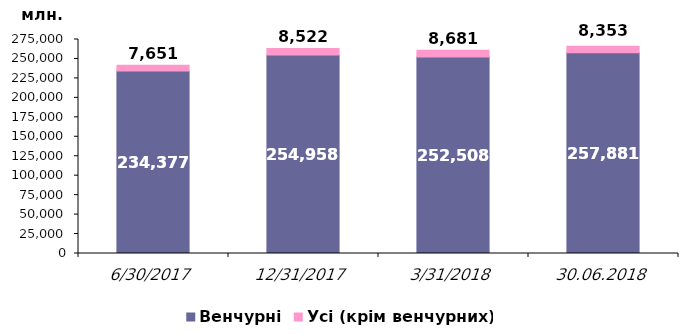
| Category | Венчурні | Усі (крім венчурних) |
|---|---|---|
| 30.06.2017 | 234376.575 | 7650.878 |
| 31.12.2017 | 254957.863 | 8521.52 |
| 31.03.2018 | 252508.217 | 8680.52 |
| 30.06.2018 | 257881.459 | 8352.685 |